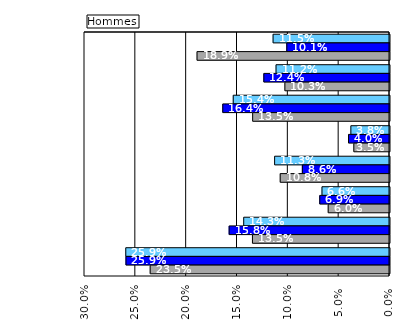
| Category | 2020 | 2021 | 2022 |
|---|---|---|---|
| COVID-19          | 0.114 | 0.101 | 0.189 |
| Convalescences après
 actes chirurgicales | 0.112 | 0.124 | 0.103 |
| Maladies du système
 ostéo-articulaire | 0.154 | 0.164 | 0.135 |
| Maladies du système 
nerveux (hors AVC) | 0.038 | 0.04 | 0.035 |
| Maladies infectieuses 
et parasitaires | 0.113 | 0.086 | 0.108 |
| Traumatismes        | 0.066 | 0.069 | 0.06 |
| Troubles mentaux et 
du comportement a)   | 0.143 | 0.158 | 0.135 |
| Autres b)           | 0.259 | 0.259 | 0.235 |